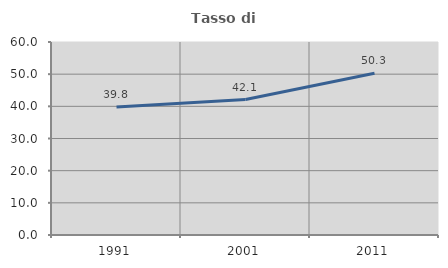
| Category | Tasso di occupazione   |
|---|---|
| 1991.0 | 39.796 |
| 2001.0 | 42.105 |
| 2011.0 | 50.303 |